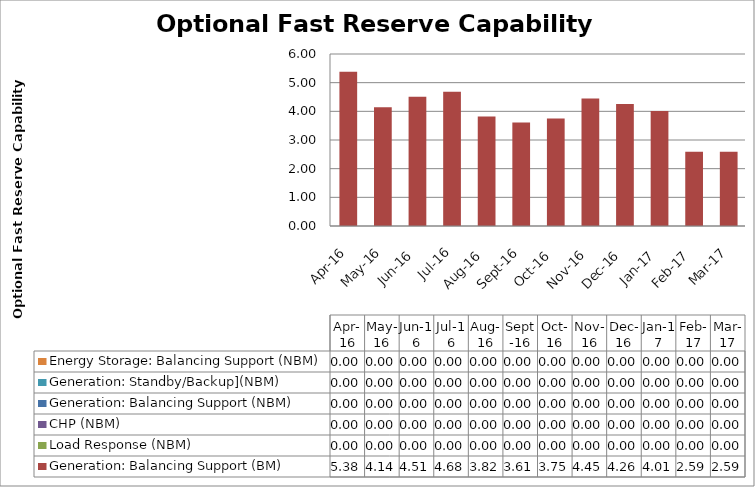
| Category | Generation: Balancing Support (BM) | Load Response (NBM) | CHP (NBM) | Generation: Balancing Support (NBM) | Generation: Standby/Backup](NBM) | Energy Storage: Balancing Support (NBM) |
|---|---|---|---|---|---|---|
| 2016-04-01 | 5.383 | 0 | 0 | 0 | 0 | 0 |
| 2016-05-01 | 4.139 | 0 | 0 | 0 | 0 | 0 |
| 2016-06-01 | 4.511 | 0 | 0 | 0 | 0 | 0 |
| 2016-07-01 | 4.683 | 0 | 0 | 0 | 0 | 0 |
| 2016-08-01 | 3.818 | 0 | 0 | 0 | 0 | 0 |
| 2016-09-01 | 3.609 | 0 | 0 | 0 | 0 | 0 |
| 2016-10-01 | 3.753 | 0 | 0 | 0 | 0 | 0 |
| 2016-11-01 | 4.452 | 0 | 0 | 0 | 0 | 0 |
| 2016-12-01 | 4.259 | 0 | 0 | 0 | 0 | 0 |
| 2017-01-01 | 4.008 | 0 | 0 | 0 | 0 | 0 |
| 2017-02-01 | 2.587 | 0 | 0 | 0 | 0 | 0 |
| 2017-03-01 | 2.591 | 0 | 0 | 0 | 0 | 0 |